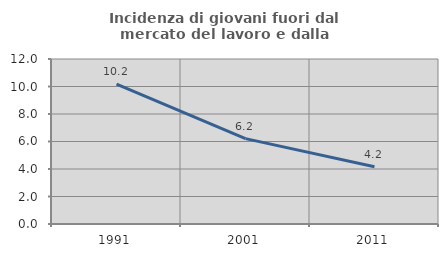
| Category | Incidenza di giovani fuori dal mercato del lavoro e dalla formazione  |
|---|---|
| 1991.0 | 10.169 |
| 2001.0 | 6.207 |
| 2011.0 | 4.167 |